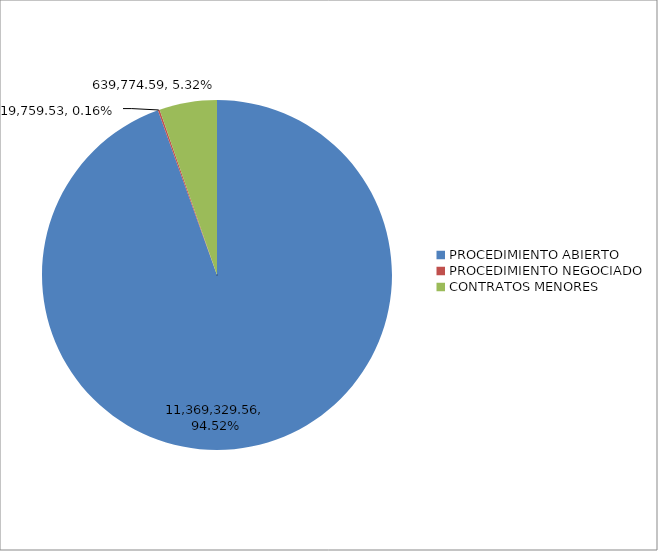
| Category | Series 0 | Series 1 |
|---|---|---|
| PROCEDIMIENTO ABIERTO  | 11369329.56 | 94.517 |
| PROCEDIMIENTO NEGOCIADO | 19759.53 | 0.164 |
| CONTRATOS MENORES | 639774.59 | 5.319 |